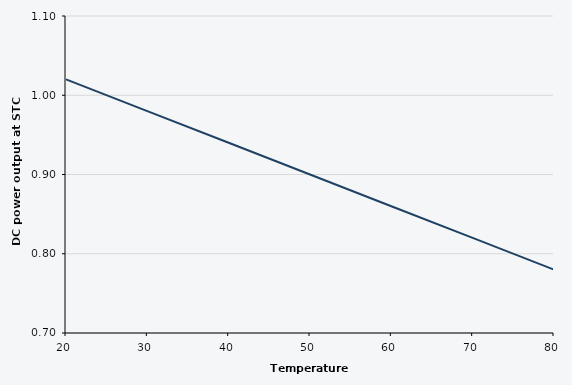
| Category | DC power at STC (%) |
|---|---|
| 20.0 | 1.02 |
| 30.0 | 0.98 |
| 40.0 | 0.94 |
| 50.0 | 0.9 |
| 60.0 | 0.86 |
| 70.0 | 0.82 |
| 80.0 | 0.78 |